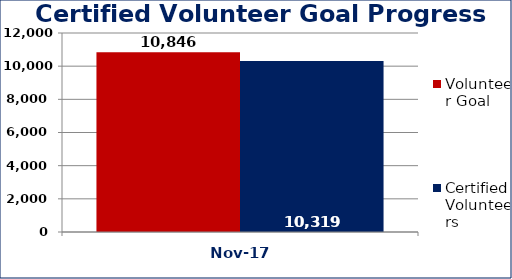
| Category | Volunteer Goal  | Certified Volunteers  |
|---|---|---|
| Nov-17 | 10846 | 10319 |